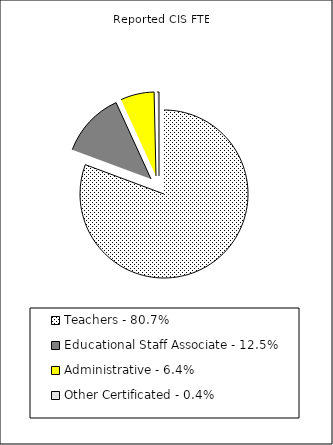
| Category | Reported FTE |
|---|---|
| Teachers - 80.7% | 62691.37 |
| Educational Staff Associate - 12.5% | 9704.58 |
| Administrative - 6.4% | 5028.51 |
| Other Certificated - 0.4% | 279.99 |